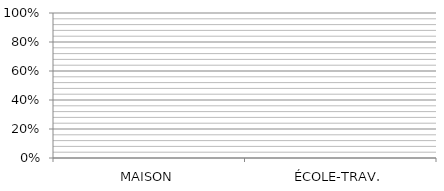
| Category | Series 0 | Series 1 | Series 2 | Series 3 |
|---|---|---|---|---|
| MAISON | 0 | 0 | 0 | 0 |
| ÉCOLE-TRAV. | 0 | 0 | 0 | 0 |